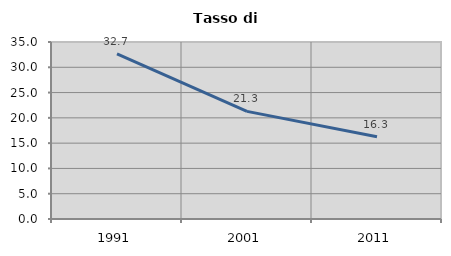
| Category | Tasso di disoccupazione   |
|---|---|
| 1991.0 | 32.663 |
| 2001.0 | 21.278 |
| 2011.0 | 16.25 |